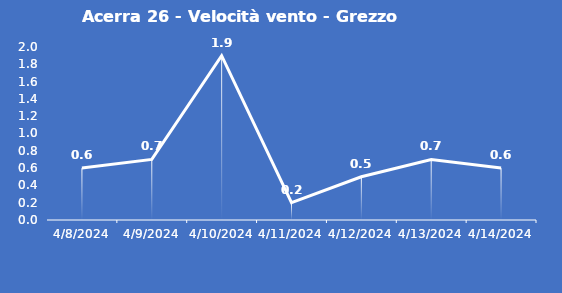
| Category | Acerra 26 - Velocità vento - Grezzo (m/s) |
|---|---|
| 4/8/24 | 0.6 |
| 4/9/24 | 0.7 |
| 4/10/24 | 1.9 |
| 4/11/24 | 0.2 |
| 4/12/24 | 0.5 |
| 4/13/24 | 0.7 |
| 4/14/24 | 0.6 |